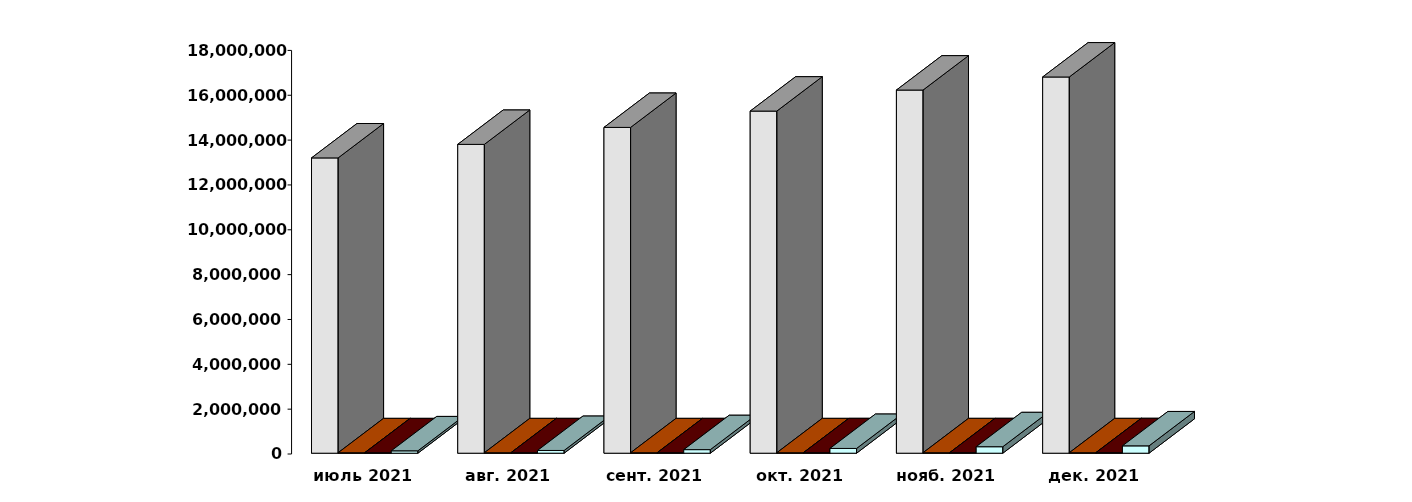
| Category | Физические лица | Юридические лица | Иностранные лица | Клиенты, передавшие свои средства в ДУ |
|---|---|---|---|---|
| 2021-07-30 | 13169586 | 19875 | 19720 | 105728 |
| 2021-08-30 | 13773190 | 19995 | 20283 | 122307 |
| 2021-09-30 | 14530193 | 20081 | 21060 | 158895 |
| 2021-10-30 | 15258509 | 20154 | 21894 | 212008 |
| 2021-11-30 | 16196130 | 20272 | 22719 | 288895 |
| 2021-12-31 | 16779069 | 20446 | 23517 | 327432 |